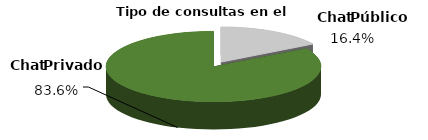
| Category | Series 0 |
|---|---|
| 0 | 2849 |
| 1 | 14557 |